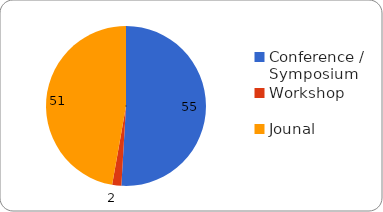
| Category | Number of papers |
|---|---|
| Conference / Symposium  | 55 |
| Workshop | 2 |
| Jounal | 51 |